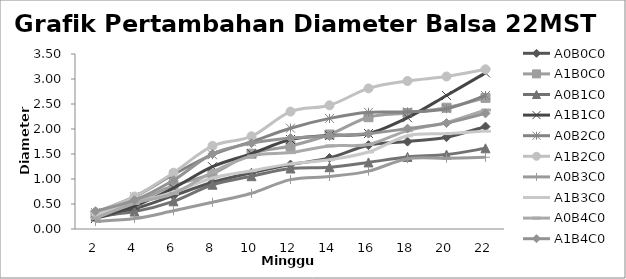
| Category | A0B0C0 | A1B0C0 | A0B1C0 | A1B1C0 | A0B2C0 | A1B2C0 | A0B3C0 | A1B3C0 | A0B4C0 | A1B4C0 |
|---|---|---|---|---|---|---|---|---|---|---|
| 2.0 | 0.222 | 0.288 | 0.26 | 0.21 | 0.328 | 0.326 | 0.152 | 0.283 | 0.214 | 0.356 |
| 4.0 | 0.4 | 0.536 | 0.348 | 0.456 | 0.646 | 0.65 | 0.208 | 0.52 | 0.516 | 0.576 |
| 6.0 | 0.666 | 0.866 | 0.554 | 0.82 | 1.09 | 1.126 | 0.364 | 0.738 | 0.71 | 0.974 |
| 8.0 | 0.934 | 1.106 | 0.886 | 1.246 | 1.486 | 1.662 | 0.534 | 1.02 | 1.14 | 1.502 |
| 10.0 | 1.124 | 1.506 | 1.056 | 1.506 | 1.746 | 1.854 | 0.714 | 1.165 | 1.46 | 1.716 |
| 12.0 | 1.288 | 1.66 | 1.21 | 1.79 | 2.016 | 2.348 | 0.988 | 1.302 | 1.528 | 1.82 |
| 14.0 | 1.42 | 1.89 | 1.236 | 1.872 | 2.212 | 2.474 | 1.05 | 1.385 | 1.662 | 1.86 |
| 16.0 | 1.676 | 2.236 | 1.332 | 1.91 | 2.334 | 2.812 | 1.158 | 1.54 | 1.69 | 1.908 |
| 18.0 | 1.748 | 2.32 | 1.442 | 2.226 | 2.342 | 2.96 | 1.406 | 1.865 | 1.968 | 2.008 |
| 20.0 | 1.836 | 2.426 | 1.488 | 2.67 | 2.406 | 3.05 | 1.416 | 1.908 | 2.128 | 2.12 |
| 22.0 | 2.048 | 2.622 | 1.614 | 3.122 | 2.67 | 3.194 | 1.434 | 1.958 | 2.38 | 2.312 |